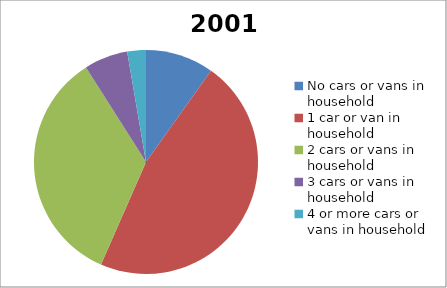
| Category | 2001 |
|---|---|
| No cars or vans in household | 161 |
| 1 car or van in household | 763 |
| 2 cars or vans in household | 562 |
| 3 cars or vans in household | 103 |
| 4 or more cars or vans in household | 44 |